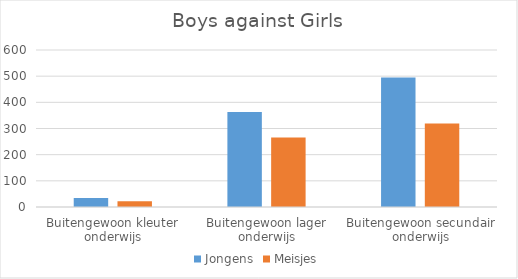
| Category | Jongens | Meisjes |
|---|---|---|
| Buitengewoon kleuter onderwijs | 34 | 22 |
| Buitengewoon lager onderwijs | 363 | 266 |
| Buitengewoon secundair onderwijs | 495 | 319 |